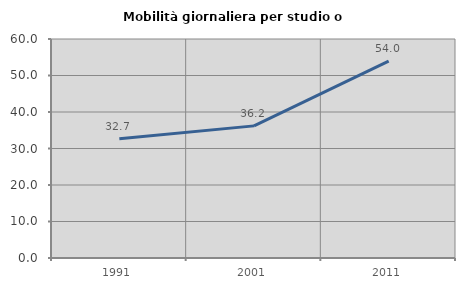
| Category | Mobilità giornaliera per studio o lavoro |
|---|---|
| 1991.0 | 32.692 |
| 2001.0 | 36.197 |
| 2011.0 | 53.958 |